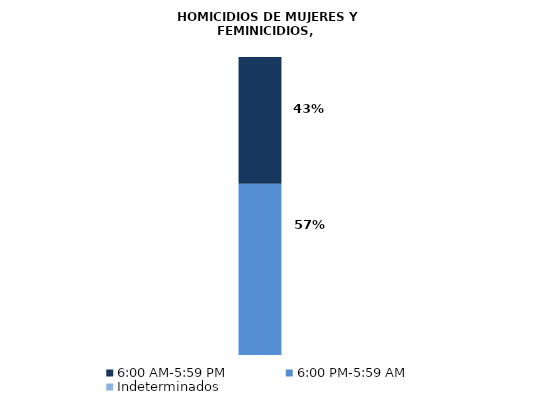
| Category | Indeterminados | 6:00 PM-5:59 AM | 6:00 AM-5:59 PM |
|---|---|---|---|
| 0 | 0 | 108 | 80 |